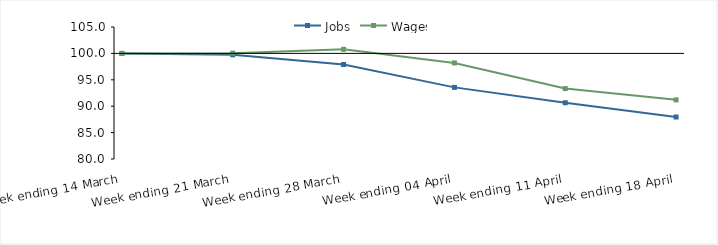
| Category | Jobs | Wages |
|---|---|---|
| 0 | 100 | 100 |
| 1900-01-01 | 99.734 | 100.044 |
| 1900-01-02 | 97.902 | 100.771 |
| 1900-01-03 | 93.564 | 98.197 |
| 1900-01-04 | 90.653 | 93.343 |
| 1900-01-05 | 87.953 | 91.201 |